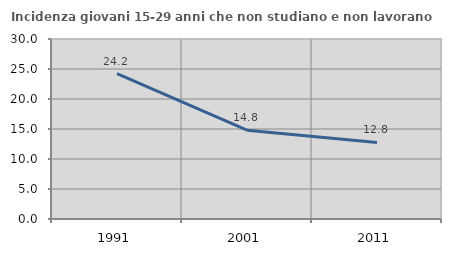
| Category | Incidenza giovani 15-29 anni che non studiano e non lavorano  |
|---|---|
| 1991.0 | 24.218 |
| 2001.0 | 14.795 |
| 2011.0 | 12.766 |